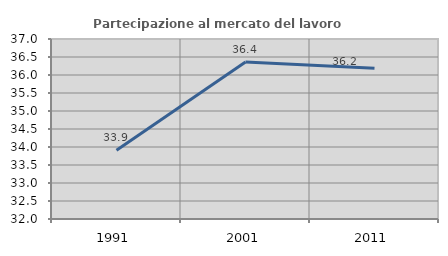
| Category | Partecipazione al mercato del lavoro  femminile |
|---|---|
| 1991.0 | 33.909 |
| 2001.0 | 36.364 |
| 2011.0 | 36.184 |